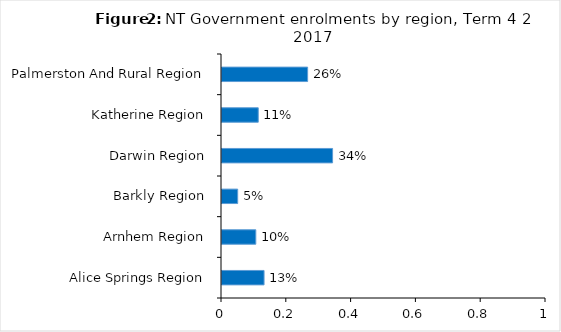
| Category | Series 0 |
|---|---|
| Alice Springs Region | 0.13 |
| Arnhem Region | 0.104 |
| Barkly Region | 0.048 |
| Darwin Region | 0.341 |
| Katherine Region | 0.112 |
| Palmerston And Rural Region | 0.264 |